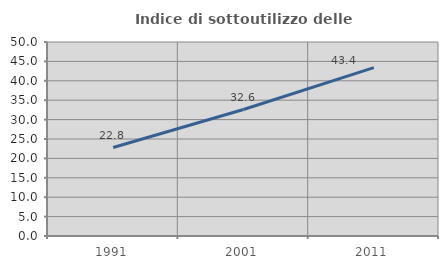
| Category | Indice di sottoutilizzo delle abitazioni  |
|---|---|
| 1991.0 | 22.796 |
| 2001.0 | 32.594 |
| 2011.0 | 43.394 |